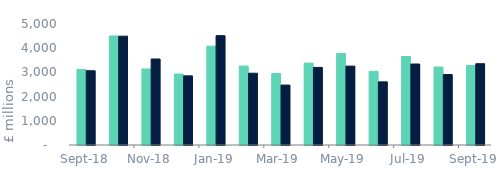
| Category | Full market | Remortgage without equity withdrawn |
|---|---|---|
| 2018-09-01 | 3123.215 | 3069.359 |
| 2018-10-01 | 4506.254 | 4497.665 |
| 2018-11-01 | 3140.547 | 3554.237 |
| 2018-12-01 | 2932.423 | 2856.967 |
| 2019-01-01 | 4085.008 | 4518.604 |
| 2019-02-01 | 3260.131 | 2965.781 |
| 2019-03-01 | 2956.304 | 2476.379 |
| 2019-04-01 | 3383.515 | 3206.457 |
| 2019-05-01 | 3782.754 | 3259.539 |
| 2019-06-01 | 3042.573 | 2609.42 |
| 2019-07-01 | 3657.67 | 3346.803 |
| 2019-08-01 | 3222.961 | 2911.762 |
| 2019-09-01 | 3283.623 | 3358.889 |